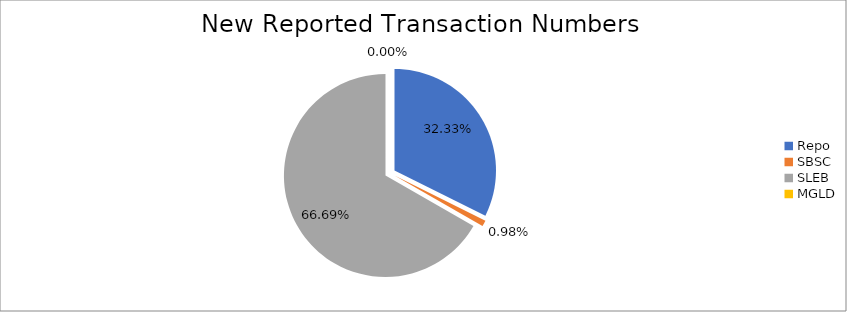
| Category | Series 0 |
|---|---|
| Repo | 353776 |
| SBSC | 10689 |
| SLEB | 729667 |
| MGLD | 25 |